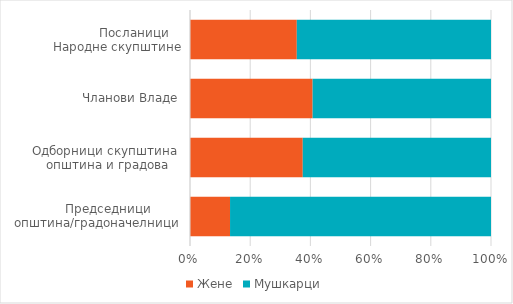
| Category | Жене | Мушкарци |
|---|---|---|
|      Председници
општина/градоначелници | 13.3 | 86.67 |
| Одборници скупштина
 општина и градова | 37.62 | 62.8 |
| Чланови Владе | 40.741 | 59.259 |
|         Посланици
Народне скупштине | 35.484 | 64.516 |